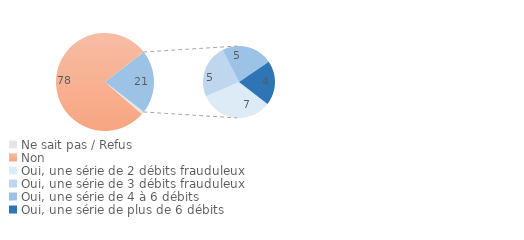
| Category | Series 0 |
|---|---|
| Ne sait pas / Refus | 1 |
| Non  | 78.15 |
| Oui, une série de 2 débits frauduleux | 6.93 |
| Oui, une série de 3 débits frauduleux | 5.04 |
| Oui, une série de 4 à 6 débits | 4.83 |
| Oui, une série de plus de 6 débits | 4.2 |